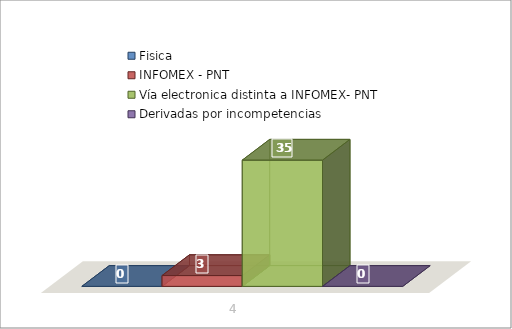
| Category | Fisica | INFOMEX - PNT | Vía electronica distinta a INFOMEX- PNT | Derivadas por incompetencias |
|---|---|---|---|---|
| 0 | 0 | 3 | 35 | 0 |